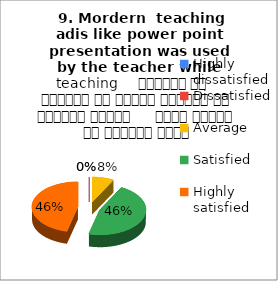
| Category |  9. Mordern  teaching adis like power point presentation was used by the teacher while teaching     शिक्षक ने शिक्षण के दौरान शिक्षण की आधुनिक तकनीक     पावर पॉइंट का प्रयोग किया |
|---|---|
| Highly dissatisfied | 0 |
| Dissatisfied | 0 |
| Average | 2 |
| Satisfied | 12 |
| Highly satisfied | 12 |